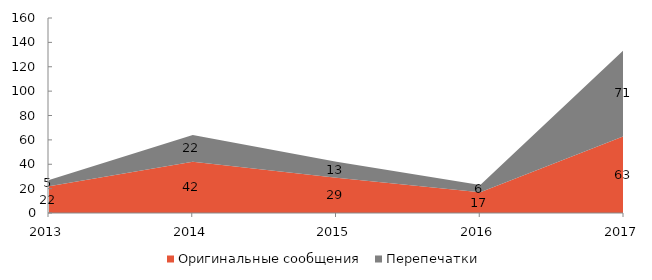
| Category | Оригинальные сообщения | Перепечатки |
|---|---|---|
| 2013 | 22 | 5 |
| 2014 | 42 | 22 |
| 2015 | 29 | 13 |
| 2016 | 17 | 6 |
| 2017 | 63 | 71 |